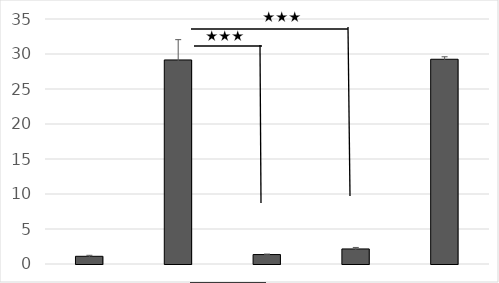
| Category | Series 0 |
|---|---|
| yw-IR | 1.1 |
| yw+IR | 29.15 |
| null +IR | 1.35 |
| Acrispr +IR | 2.15 |
| Bcrispr +IR | 29.25 |